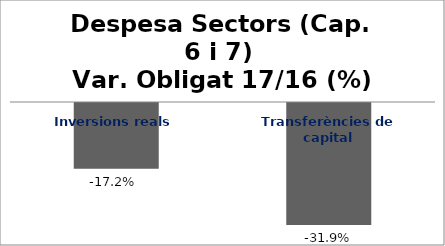
| Category | Series 0 |
|---|---|
| Inversions reals | -0.172 |
| Transferències de capital | -0.319 |